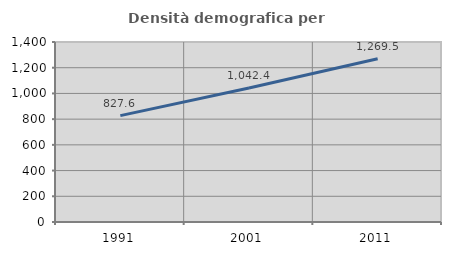
| Category | Densità demografica |
|---|---|
| 1991.0 | 827.569 |
| 2001.0 | 1042.419 |
| 2011.0 | 1269.511 |